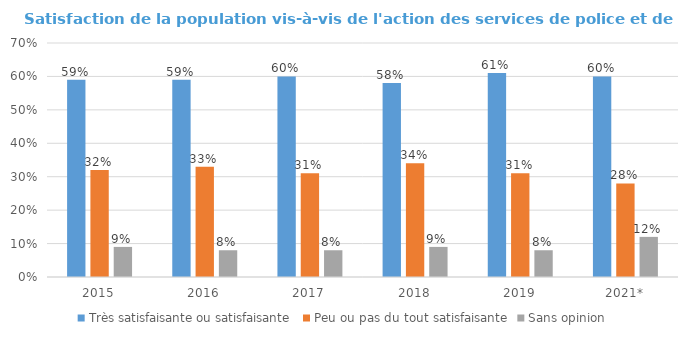
| Category | Très satisfaisante ou satisfaisante | Peu ou pas du tout satisfaisante | Sans opinion |
|---|---|---|---|
| 2015 | 0.59 | 0.32 | 0.09 |
| 2016 | 0.59 | 0.33 | 0.08 |
| 2017 | 0.6 | 0.31 | 0.08 |
| 2018 | 0.58 | 0.34 | 0.09 |
| 2019 | 0.61 | 0.31 | 0.08 |
| 2021* | 0.6 | 0.28 | 0.12 |